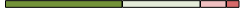
| Category | Series 0 | Series 1 | Series 2 | Series 3 |
|---|---|---|---|---|
| 0 | 9 | 6 | 2 | 1 |